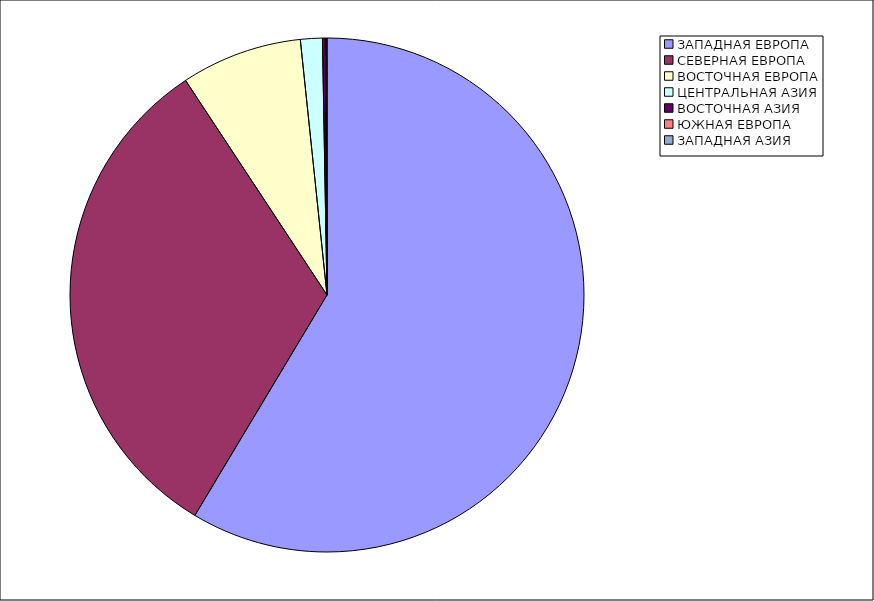
| Category | Оборот |
|---|---|
| ЗАПАДНАЯ ЕВРОПА | 58.595 |
| СЕВЕРНАЯ ЕВРОПА | 32.129 |
| ВОСТОЧНАЯ ЕВРОПА | 7.618 |
| ЦЕНТРАЛЬНАЯ АЗИЯ | 1.376 |
| ВОСТОЧНАЯ АЗИЯ | 0.18 |
| ЮЖНАЯ ЕВРОПА | 0.078 |
| ЗАПАДНАЯ АЗИЯ | 0.024 |